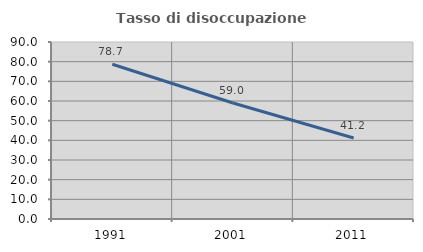
| Category | Tasso di disoccupazione giovanile  |
|---|---|
| 1991.0 | 78.699 |
| 2001.0 | 59 |
| 2011.0 | 41.197 |